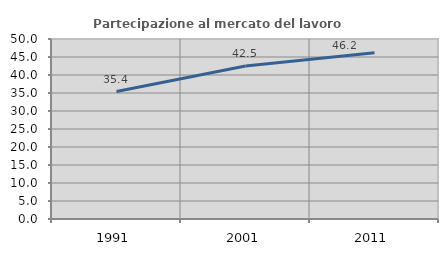
| Category | Partecipazione al mercato del lavoro  femminile |
|---|---|
| 1991.0 | 35.391 |
| 2001.0 | 42.48 |
| 2011.0 | 46.198 |